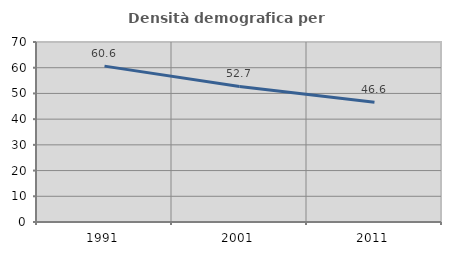
| Category | Densità demografica |
|---|---|
| 1991.0 | 60.618 |
| 2001.0 | 52.702 |
| 2011.0 | 46.595 |